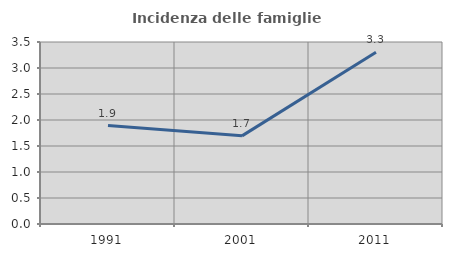
| Category | Incidenza delle famiglie numerose |
|---|---|
| 1991.0 | 1.894 |
| 2001.0 | 1.695 |
| 2011.0 | 3.303 |